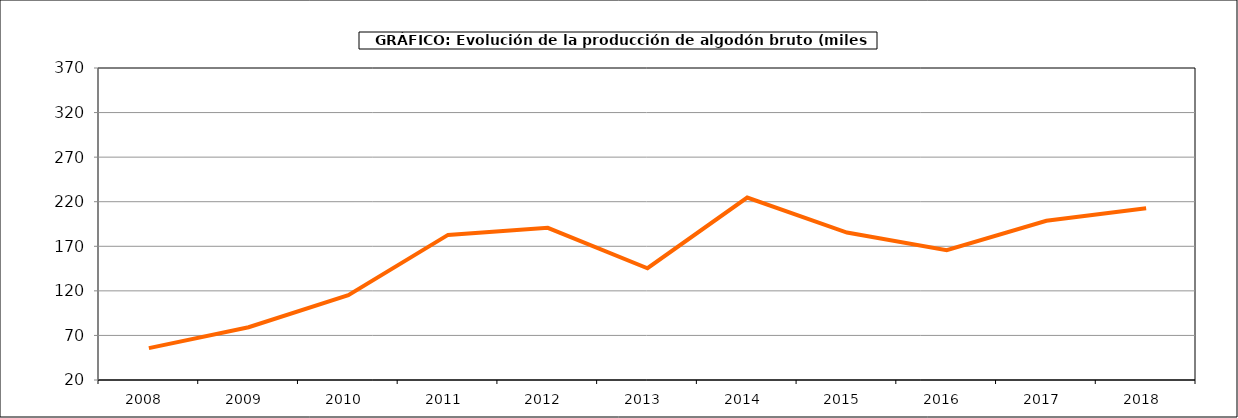
| Category | Producción |
|---|---|
| 2008.0 | 55.731 |
| 2009.0 | 79.22 |
| 2010.0 | 115.088 |
| 2011.0 | 182.781 |
| 2012.0 | 190.7 |
| 2013.0 | 145.356 |
| 2014.0 | 224.734 |
| 2015.0 | 185.446 |
| 2016.0 | 165.596 |
| 2017.0 | 198.547 |
| 2018.0 | 212.587 |